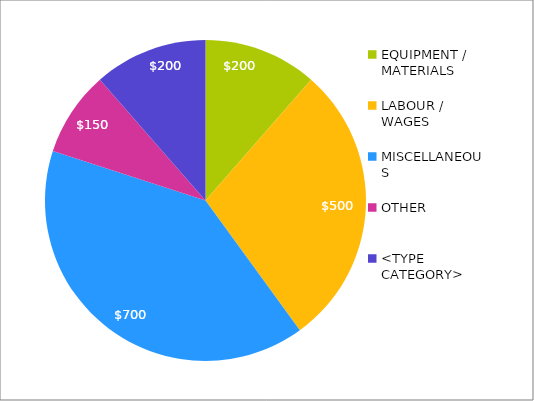
| Category | Series 0 |
|---|---|
| EQUIPMENT / MATERIALS | 200 |
| LABOUR / WAGES | 500 |
| MISCELLANEOUS | 700 |
| OTHER | 150 |
| <TYPE CATEGORY> | 200 |